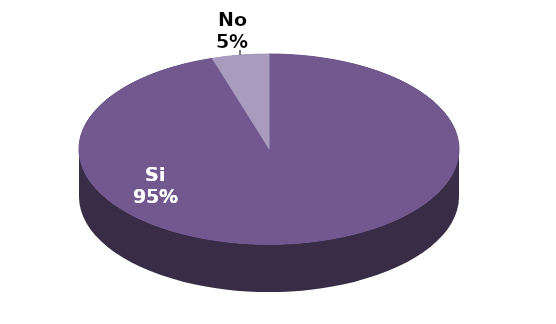
| Category | Series 1 |
|---|---|
| Si | 196 |
| No | 10 |